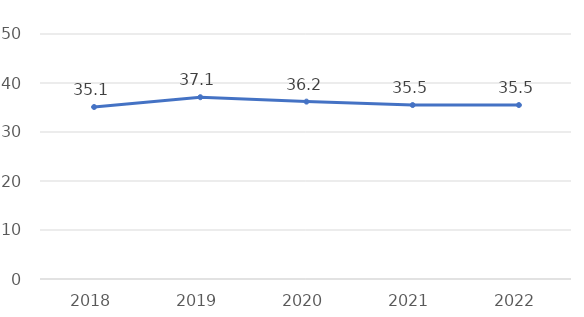
| Category | Series 0 |
|---|---|
| 2018.0 | 35.1 |
| 2019.0 | 37.1 |
| 2020.0 | 36.2 |
| 2021.0 | 35.5 |
| 2022.0 | 35.5 |